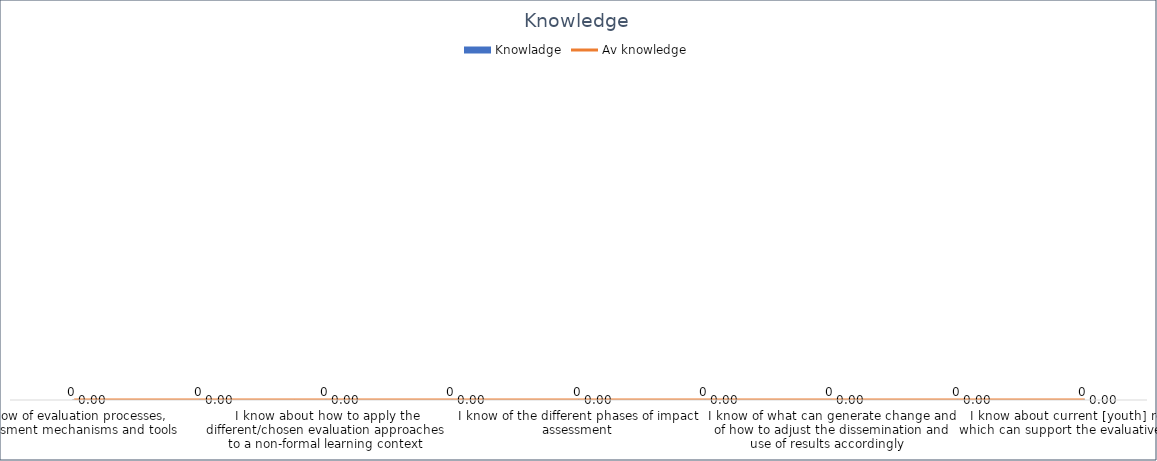
| Category | Knowladge |
|---|---|
| I know of evaluation processes, assessment mechanisms and tools | 0 |
| I know about where and how to secure adequate data/material for evaluation | 0 |
| I know about how to apply the different/chosen evaluation approaches to a non-formal learning context | 0 |
| I know about quality assurance and what it includes | 0 |
| I know of the different phases of impact assessment | 0 |
| I know of ICT-related techniques with regard to assessment and evaluation | 0 |
| I know of what can generate change and of how to adjust the dissemination and use of results accordingly   | 0 |
| I know different methods to collect data | 0 |
| I know about current [youth] research which can support the evaluative process | 0 |